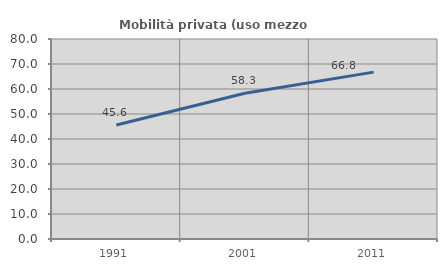
| Category | Mobilità privata (uso mezzo privato) |
|---|---|
| 1991.0 | 45.569 |
| 2001.0 | 58.285 |
| 2011.0 | 66.756 |